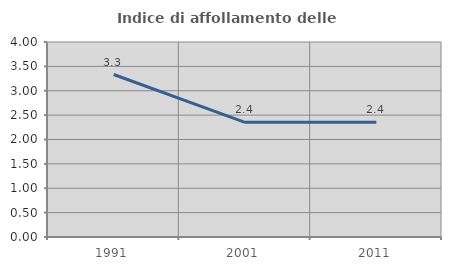
| Category | Indice di affollamento delle abitazioni  |
|---|---|
| 1991.0 | 3.333 |
| 2001.0 | 2.353 |
| 2011.0 | 2.353 |